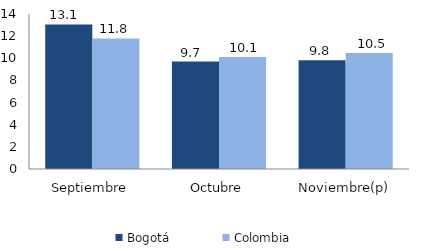
| Category | Bogotá | Colombia |
|---|---|---|
| Septiembre | 13.063 | 11.793 |
| Octubre | 9.709 | 10.113 |
| Noviembre(p) | 9.831 | 10.476 |